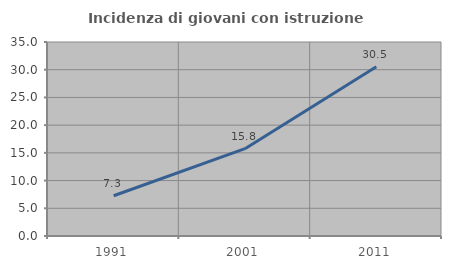
| Category | Incidenza di giovani con istruzione universitaria |
|---|---|
| 1991.0 | 7.258 |
| 2001.0 | 15.753 |
| 2011.0 | 30.547 |